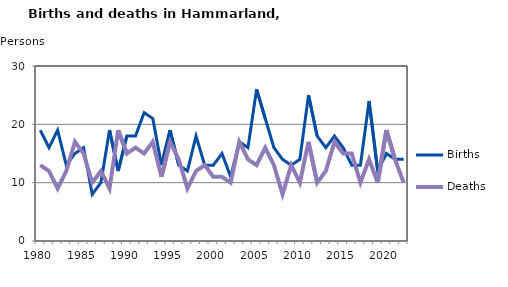
| Category | Births | Deaths |
|---|---|---|
| 1980.0 | 19 | 13 |
| 1981.0 | 16 | 12 |
| 1982.0 | 19 | 9 |
| 1983.0 | 13 | 12 |
| 1984.0 | 15 | 17 |
| 1985.0 | 16 | 15 |
| 1986.0 | 8 | 10 |
| 1987.0 | 10 | 12 |
| 1988.0 | 19 | 9 |
| 1989.0 | 12 | 19 |
| 1990.0 | 18 | 15 |
| 1991.0 | 18 | 16 |
| 1992.0 | 22 | 15 |
| 1993.0 | 21 | 17 |
| 1994.0 | 13 | 11 |
| 1995.0 | 19 | 17 |
| 1996.0 | 13 | 14 |
| 1997.0 | 12 | 9 |
| 1998.0 | 18 | 12 |
| 1999.0 | 13 | 13 |
| 2000.0 | 13 | 11 |
| 2001.0 | 15 | 11 |
| 2002.0 | 11 | 10 |
| 2003.0 | 17 | 17 |
| 2004.0 | 16 | 14 |
| 2005.0 | 26 | 13 |
| 2006.0 | 21 | 16 |
| 2007.0 | 16 | 13 |
| 2008.0 | 14 | 8 |
| 2009.0 | 13 | 13 |
| 2010.0 | 14 | 10 |
| 2011.0 | 25 | 17 |
| 2012.0 | 18 | 10 |
| 2013.0 | 16 | 12 |
| 2014.0 | 18 | 17 |
| 2015.0 | 16 | 15 |
| 2016.0 | 13 | 15 |
| 2017.0 | 13 | 10 |
| 2018.0 | 24 | 14 |
| 2019.0 | 12 | 10 |
| 2020.0 | 15 | 19 |
| 2021.0 | 14 | 14 |
| 2022.0 | 14 | 10 |